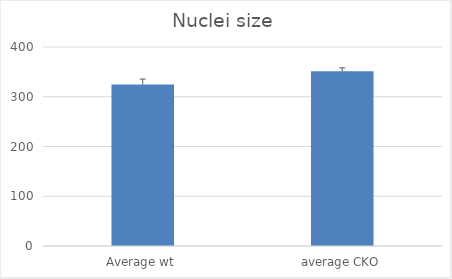
| Category | Series 0 |
|---|---|
| Average wt | 324.738 |
| average CKO | 351.42 |